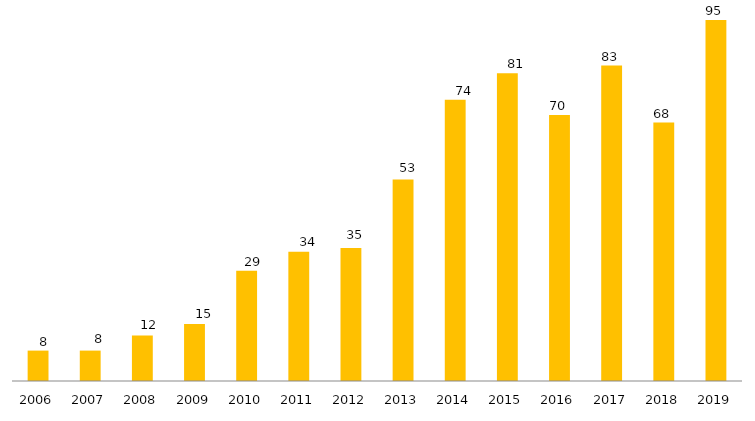
| Category | Programa |
|---|---|
| 2006.0 | 8 |
| 2007.0 | 8 |
| 2008.0 | 12 |
| 2009.0 | 15 |
| 2010.0 | 29 |
| 2011.0 | 34 |
| 2012.0 | 35 |
| 2013.0 | 53 |
| 2014.0 | 74 |
| 2015.0 | 81 |
| 2016.0 | 70 |
| 2017.0 | 83 |
| 2018.0 | 68 |
| 2019.0 | 95 |